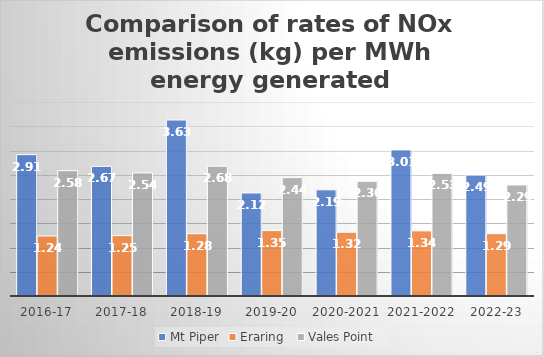
| Category | Mt Piper |  Eraring   | Vales Point  |
|---|---|---|---|
| 2016-17 | 2.914 | 1.238 | 2.584 |
| 2017-18 | 2.673 | 1.245 | 2.538 |
| 2018-19 | 3.629 | 1.285 | 2.677 |
| 2019-20 | 2.124 | 1.349 | 2.441 |
| 2020-2021 | 2.189 | 1.315 | 2.365 |
| 2021-2022 | 3.012 | 1.343 | 2.528 |
| 2022-23 | 2.493 | 1.286 | 2.289 |